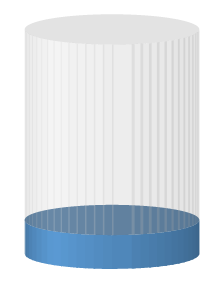
| Category | Series 0 | Series 1 |
|---|---|---|
| 0 | 1350 | 7600 |